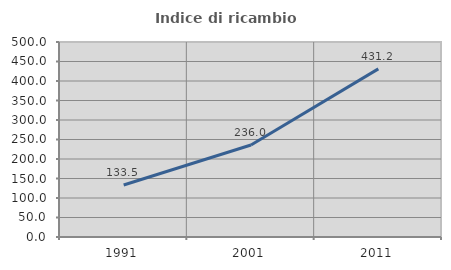
| Category | Indice di ricambio occupazionale  |
|---|---|
| 1991.0 | 133.471 |
| 2001.0 | 236.039 |
| 2011.0 | 431.174 |